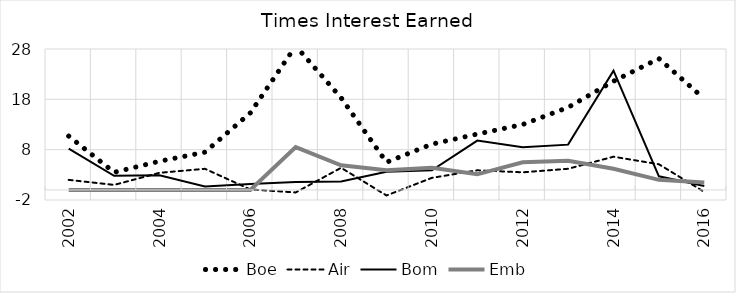
| Category | Boe | Air | Bom | Emb |
|---|---|---|---|---|
| 2002.0 | 10.7 | 2 | 8.2 | 0 |
| 2003.0 | 3.5 | 1 | 2.8 | 0 |
| 2004.0 | 5.7 | 3.4 | 2.9 | 0 |
| 2005.0 | 7.5 | 4.2 | 0.7 | 0 |
| 2006.0 | 15.3 | 0.1 | 1.2 | 0 |
| 2007.0 | 28.6 | -0.5 | 1.6 | 8.5 |
| 2008.0 | 18.3 | 4.4 | 1.7 | 4.9 |
| 2009.0 | 5.5 | -1.1 | 3.6 | 3.9 |
| 2010.0 | 9.1 | 2.4 | 3.9 | 4.4 |
| 2011.0 | 11.1 | 3.9 | 9.8 | 3.1 |
| 2012.0 | 13 | 3.5 | 8.5 | 5.5 |
| 2013.0 | 16.4 | 4.2 | 9 | 5.8 |
| 2014.0 | 21.6 | 6.6 | 23.7 | 4.2 |
| 2015.0 | 26.1 | 5.1 | 2.7 | 2 |
| 2016.0 | 18.1 | -0.4 | 0.8 | 1.5 |